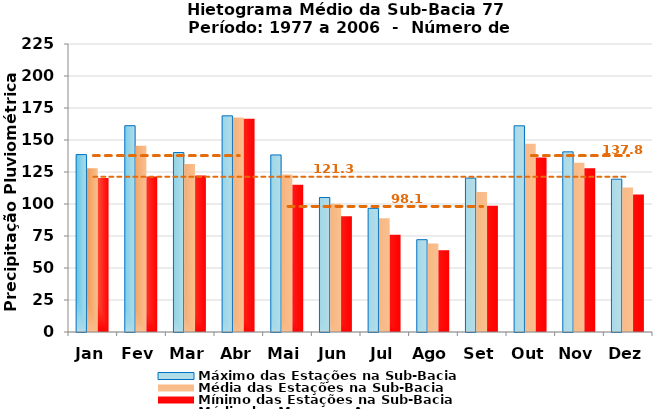
| Category | Máximo das Estações na Sub-Bacia | Média das Estações na Sub-Bacia | Mínimo das Estações na Sub-Bacia |
|---|---|---|---|
| Jan | 138.611 | 127.863 | 120.37 |
| Fev | 161.159 | 145.531 | 121.423 |
| Mar | 140.207 | 131.311 | 122.293 |
| Abr | 168.88 | 167.632 | 166.541 |
| Mai | 138.327 | 123.037 | 115.107 |
| Jun | 105.078 | 100.141 | 90.517 |
| Jul | 96.611 | 88.818 | 75.969 |
| Ago | 72.129 | 69.203 | 63.893 |
| Set | 120.246 | 109.453 | 98.589 |
| Out | 161.093 | 147.161 | 136.324 |
| Nov | 140.741 | 132.263 | 128.018 |
| Dez | 119.373 | 112.951 | 107.476 |